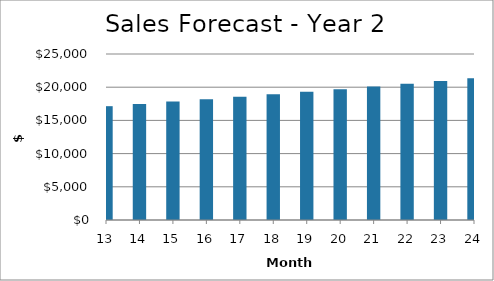
| Category | Year 2 |
|---|---|
| 13.0 | 17141.418 |
| 14.0 | 17485.96 |
| 15.0 | 17837.428 |
| 16.0 | 18195.96 |
| 17.0 | 18561.699 |
| 18.0 | 18934.789 |
| 19.0 | 19315.379 |
| 20.0 | 19703.618 |
| 21.0 | 20099.66 |
| 22.0 | 20503.664 |
| 23.0 | 20915.787 |
| 24.0 | 21336.195 |